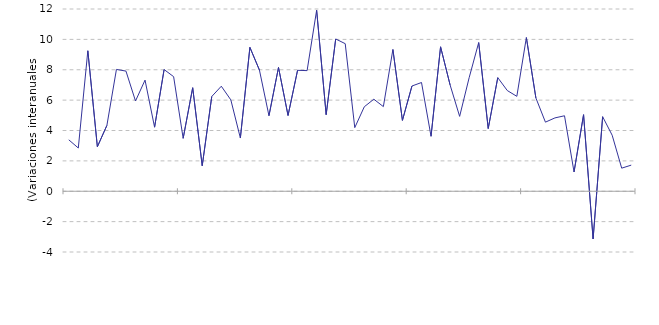
| Category | La Rioja |
|---|---|
| nan | 3.387 |
| nan | 2.847 |
| nan | 9.25 |
| nan | 2.929 |
| 2015.0 | 4.335 |
| nan | 8.021 |
| nan | 7.912 |
| nan | 5.942 |
| nan | 7.319 |
| nan | 4.218 |
| nan | 8.014 |
| nan | 7.545 |
| nan | 3.485 |
| nan | 6.815 |
| nan | 1.679 |
| nan | 6.239 |
| 2016.0 | 6.916 |
| nan | 6.016 |
| nan | 3.505 |
| nan | 9.474 |
| nan | 7.98 |
| nan | 4.973 |
| nan | 8.15 |
| nan | 4.989 |
| nan | 7.962 |
| nan | 7.943 |
| nan | 11.919 |
| nan | 5.043 |
| 2017.0 | 10.026 |
| nan | 9.716 |
| nan | 4.189 |
| nan | 5.563 |
| nan | 6.06 |
| nan | 5.572 |
| nan | 9.333 |
| nan | 4.667 |
| nan | 6.93 |
| nan | 7.16 |
| nan | 3.62 |
| nan | 9.51 |
| 2018.0 | 7 |
| nan | 4.93 |
| nan | 7.48 |
| nan | 9.79 |
| nan | 4.13 |
| nan | 7.48 |
| nan | 6.63 |
| nan | 6.25 |
| nan | 10.12 |
| nan | 6.14 |
| nan | 4.55 |
| nan | 4.83 |
| 2019.0 | 4.97 |
| nan | 1.27 |
| nan | 5.04 |
| nan | -3.14 |
| nan | 4.91 |
| nan | 3.69 |
| nan | 1.52 |